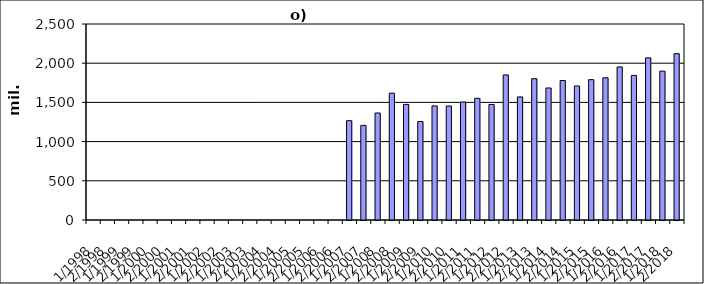
| Category | Series 0 |
|---|---|
| 1/1998 | 0 |
| 2/1998 | 0 |
| 1/1999 | 0 |
| 2/1999 | 0 |
| 1/2000 | 0 |
| 2/2000 | 0 |
| 1/2001 | 0 |
| 2/2001 | 0 |
| 1/2002 | 0 |
| 2/2002 | 0 |
| 1/2003 | 0 |
| 2/2003 | 0 |
| 1/2004 | 0 |
| 2/2004 | 0 |
| 1/2005 | 0 |
| 2/2005 | 0 |
| 1/2006 | 0 |
| 2/2006 | 0 |
| 1/2007 | 1266888 |
| 2/2007 | 1206960 |
| 1/2008 | 1364597.101 |
| 2/2008 | 1617440.899 |
| 1/2009 | 1474589 |
| 2/2009 | 1256738 |
| 1/2010 | 1455205 |
| 2/2010 | 1453989 |
| 1/2011 | 1504708 |
| 2/2011 | 1552649 |
| 1/2012 | 1473843 |
| 2/2012 | 1849901 |
| 1/2013 | 1569918 |
| 2/2013 | 1802145 |
| 1/2014 | 1683991 |
| 2/2014 | 1778949 |
| 1/2015 | 1709287 |
| 2/2015 | 1790014 |
| 1/2016 | 1813653 |
| 2/2016 | 1951933 |
| 1/2017 | 1844263 |
| 2/2017 | 2068103 |
| 1/2018 | 1898617.665 |
| 2/2018 | 2121242.673 |